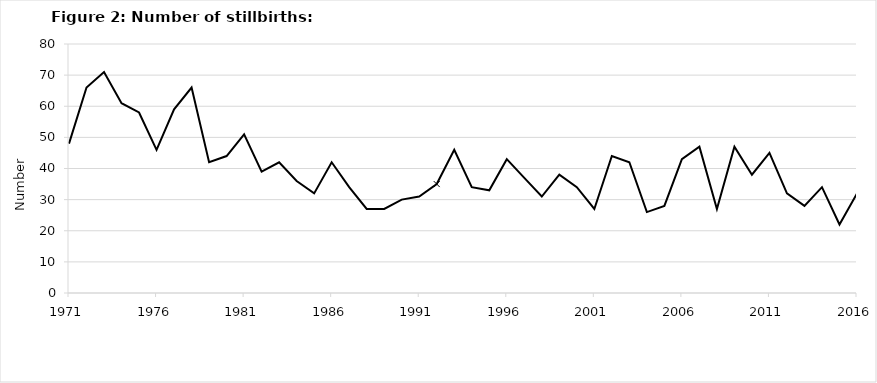
| Category | Series 0 |
|---|---|
| 1971.0 | 48 |
| 1972.0 | 66 |
| 1973.0 | 71 |
| 1974.0 | 61 |
| 1975.0 | 58 |
| 1976.0 | 46 |
| 1977.0 | 59 |
| 1978.0 | 66 |
| 1979.0 | 42 |
| 1980.0 | 44 |
| 1981.0 | 51 |
| 1982.0 | 39 |
| 1983.0 | 42 |
| 1984.0 | 36 |
| 1985.0 | 32 |
| 1986.0 | 42 |
| 1987.0 | 34 |
| 1988.0 | 27 |
| 1989.0 | 27 |
| 1990.0 | 30 |
| 1991.0 | 31 |
| 1992.0 | 35 |
| 1993.0 | 46 |
| 1994.0 | 34 |
| 1995.0 | 33 |
| 1996.0 | 43 |
| 1997.0 | 37 |
| 1998.0 | 31 |
| 1999.0 | 38 |
| 2000.0 | 34 |
| 2001.0 | 27 |
| 2002.0 | 44 |
| 2003.0 | 42 |
| 2004.0 | 26 |
| 2005.0 | 28 |
| 2006.0 | 43 |
| 2007.0 | 47 |
| 2008.0 | 27 |
| 2009.0 | 47 |
| 2010.0 | 38 |
| 2011.0 | 45 |
| 2012.0 | 32 |
| 2013.0 | 28 |
| 2014.0 | 34 |
| 2015.0 | 22 |
| 2016.0 | 32 |